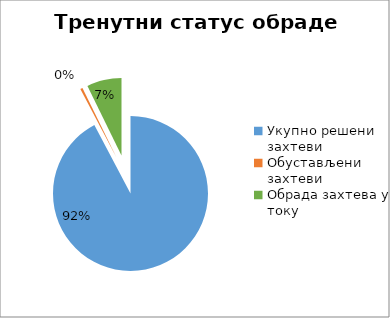
| Category | Series 0 |
|---|---|
| Укупно решени захтеви | 51638 |
| Обустављени захтеви | 270 |
| Обрада захтева у току | 4052 |